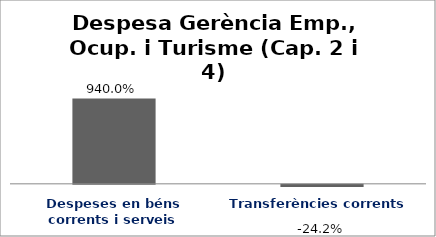
| Category | Series 0 |
|---|---|
| Despeses en béns corrents i serveis | 9.4 |
| Transferències corrents | -0.242 |